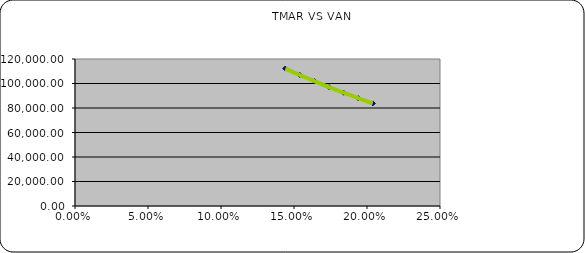
| Category | Series 0 |
|---|---|
| 0.204 | 83755.79 |
| 0.194 | 88022.65 |
| 0.184 | 92465.4 |
| 0.174 | 97093.35 |
| 0.164 | 101916.4 |
| 0.154 | 106945.07 |
| 0.144 | 112190.6 |